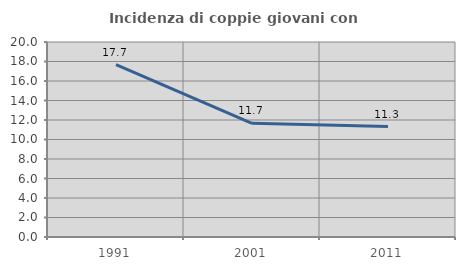
| Category | Incidenza di coppie giovani con figli |
|---|---|
| 1991.0 | 17.682 |
| 2001.0 | 11.663 |
| 2011.0 | 11.324 |